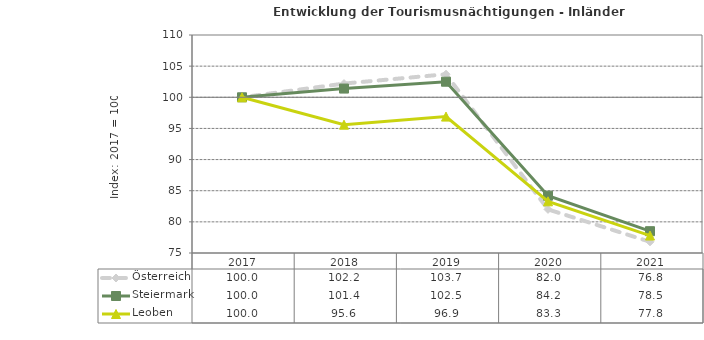
| Category | Österreich | Steiermark | Leoben |
|---|---|---|---|
| 2021.0 | 76.8 | 78.5 | 77.8 |
| 2020.0 | 82 | 84.2 | 83.3 |
| 2019.0 | 103.7 | 102.5 | 96.9 |
| 2018.0 | 102.2 | 101.4 | 95.6 |
| 2017.0 | 100 | 100 | 100 |